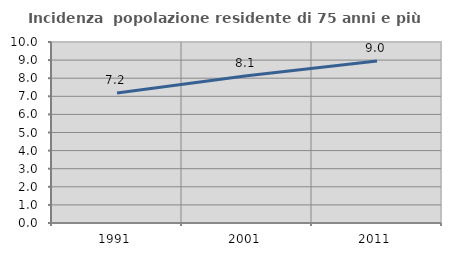
| Category | Incidenza  popolazione residente di 75 anni e più |
|---|---|
| 1991.0 | 7.188 |
| 2001.0 | 8.135 |
| 2011.0 | 8.954 |